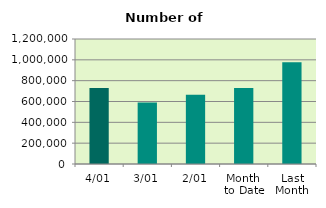
| Category | Series 0 |
|---|---|
| 4/01 | 729464 |
| 3/01 | 590480 |
| 2/01 | 664274 |
| Month 
to Date | 729464 |
| Last
Month | 976608.095 |